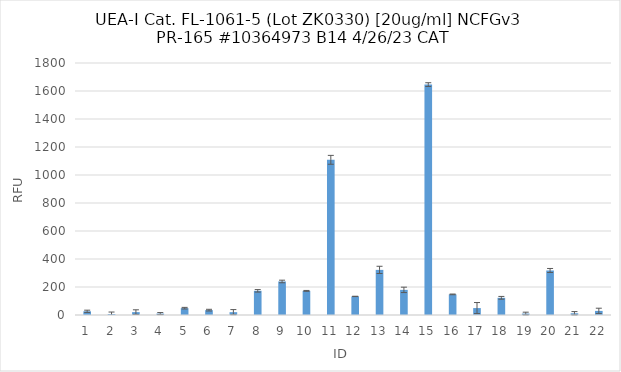
| Category | RFU |
|---|---|
| 0 | 26.5 |
| 1 | 6.5 |
| 2 | 20.5 |
| 3 | 10 |
| 4 | 48.75 |
| 5 | 34.75 |
| 6 | 20.25 |
| 7 | 172.75 |
| 8 | 239.5 |
| 9 | 172.25 |
| 10 | 1108.5 |
| 11 | 132.75 |
| 12 | 322.25 |
| 13 | 179.5 |
| 14 | 1645.75 |
| 15 | 147.25 |
| 16 | 49.5 |
| 17 | 122.75 |
| 18 | 10.25 |
| 19 | 318 |
| 20 | 12.25 |
| 21 | 29.25 |